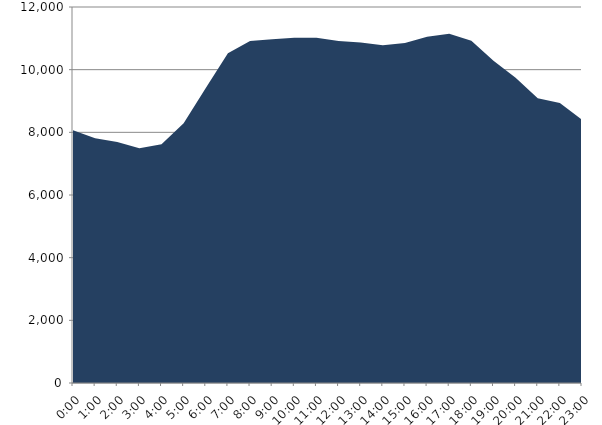
| Category | Series 0 | Series 1 |
|---|---|---|
| 2016-12-21 |  | 8065.01 |
| 2016-12-21 01:00:00 |  | 7810.884 |
| 2016-12-21 02:00:00 |  | 7690.84 |
| 2016-12-21 03:00:00 |  | 7492.842 |
| 2016-12-21 04:00:00 |  | 7616.689 |
| 2016-12-21 05:00:00 |  | 8288.548 |
| 2016-12-21 06:00:00 |  | 9412.653 |
| 2016-12-21 07:00:00 |  | 10527.217 |
| 2016-12-21 08:00:00 |  | 10918.174 |
| 2016-12-21 09:00:00 |  | 10973.711 |
| 2016-12-21 10:00:00 |  | 11021.408 |
| 2016-12-21 11:00:00 |  | 11015.849 |
| 2016-12-21 12:00:00 |  | 10913.248 |
| 2016-12-21 13:00:00 |  | 10870.73 |
| 2016-12-21 14:00:00 |  | 10779.326 |
| 2016-12-21 15:00:00 |  | 10852.163 |
| 2016-12-21 16:00:00 |  | 11048.83 |
| 2016-12-21 17:00:00 |  | 11148.558 |
| 2016-12-21 18:00:00 |  | 10921.969 |
| 2016-12-21 19:00:00 |  | 10285.451 |
| 2016-12-21 20:00:00 |  | 9745.281 |
| 2016-12-21 21:00:00 |  | 9089.039 |
| 2016-12-21 22:00:00 |  | 8934.396 |
| 2016-12-21 23:00:00 |  | 8401.45 |